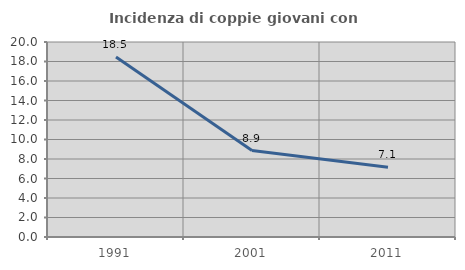
| Category | Incidenza di coppie giovani con figli |
|---|---|
| 1991.0 | 18.465 |
| 2001.0 | 8.867 |
| 2011.0 | 7.143 |